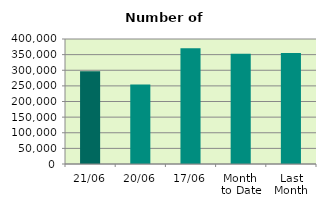
| Category | Series 0 |
|---|---|
| 21/06 | 297088 |
| 20/06 | 254008 |
| 17/06 | 370312 |
| Month 
to Date | 353169.143 |
| Last
Month | 355289.273 |